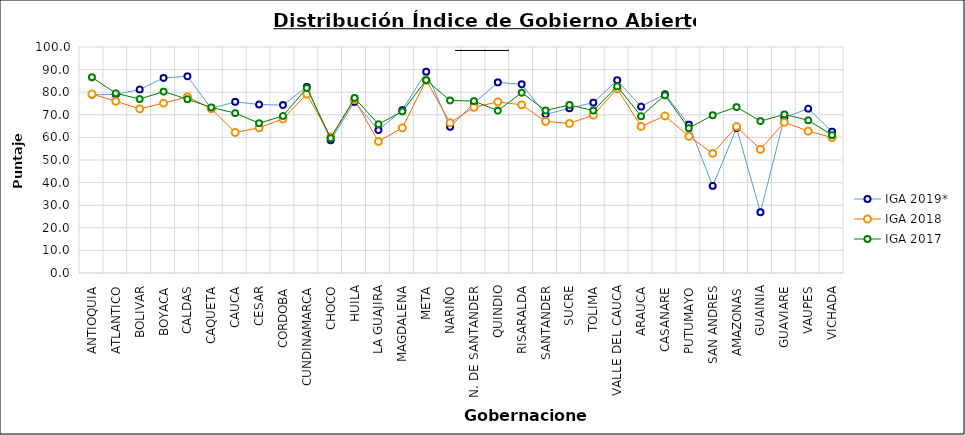
| Category | IGA 2019* | IGA 2018 | IGA 2017 |
|---|---|---|---|
| ANTIOQUIA | 78.891 | 79.203 | 86.61 |
| ATLANTICO | 79.008 | 75.975 | 79.515 |
| BOLIVAR | 81.215 | 72.631 | 76.992 |
| BOYACA | 86.279 | 75.148 | 80.271 |
| CALDAS | 87.027 | 77.97 | 76.913 |
| CAQUETA | 72.76 | 72.676 | 73.248 |
| CAUCA | 75.735 | 62.183 | 70.753 |
| CESAR | 74.568 | 64.243 | 66.283 |
| CORDOBA | 74.297 | 68.179 | 69.495 |
| CUNDINAMARCA | 82.364 | 79.122 | 81.845 |
| CHOCO | 58.723 | 60.204 | 59.644 |
| HUILA | 75.705 | 76.679 | 77.436 |
| LA GUAJIRA | 63.223 | 58.204 | 65.831 |
| MAGDALENA | 72.123 | 64.232 | 71.491 |
| META | 89.056 | 85.315 | 85.316 |
| NARIÑO | 64.693 | 66.484 | 76.335 |
| N. DE SANTANDER | 75.069 | 73.311 | 76.065 |
| QUINDIO | 84.345 | 75.708 | 71.835 |
| RISARALDA | 83.503 | 74.387 | 79.767 |
| SANTANDER | 70.159 | 67.069 | 71.892 |
| SUCRE | 72.896 | 66.19 | 74.36 |
| TOLIMA | 75.39 | 69.879 | 71.878 |
| VALLE DEL CAUCA | 85.295 | 81.516 | 82.597 |
| ARAUCA | 73.633 | 64.843 | 69.376 |
| CASANARE | 79.133 | 69.51 | 78.624 |
| PUTUMAYO | 65.653 | 60.517 | 64.068 |
| SAN ANDRES | 38.55 | 52.943 | 69.825 |
| AMAZONAS | 64.106 | 64.792 | 73.405 |
| GUAINIA | 26.884 | 54.71 | 67.186 |
| GUAVIARE | 68.742 | 66.69 | 70.165 |
| VAUPES | 72.712 | 62.789 | 67.577 |
| VICHADA | 62.531 | 59.909 | 61.004 |